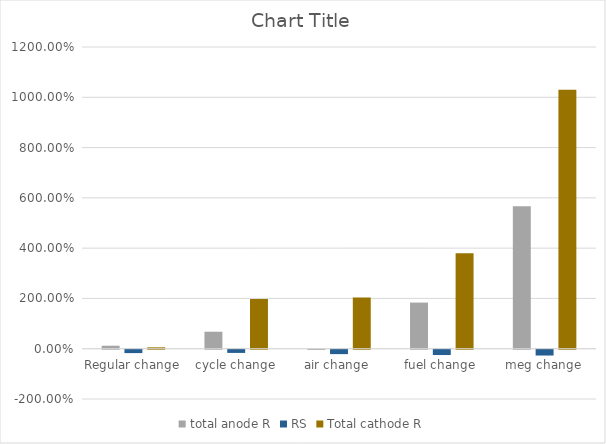
| Category | total anode R | RS | Total cathode R |
|---|---|---|---|
| Regular change | 0.119 | -0.135 | 0.055 |
| cycle change | 0.676 | -0.127 | 1.976 |
| air change  | -0.005 | -0.176 | 2.04 |
| fuel change | 1.835 | -0.212 | 3.801 |
| meg change | 5.667 | -0.231 | 10.302 |